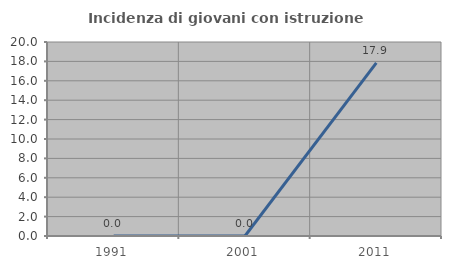
| Category | Incidenza di giovani con istruzione universitaria |
|---|---|
| 1991.0 | 0 |
| 2001.0 | 0 |
| 2011.0 | 17.857 |